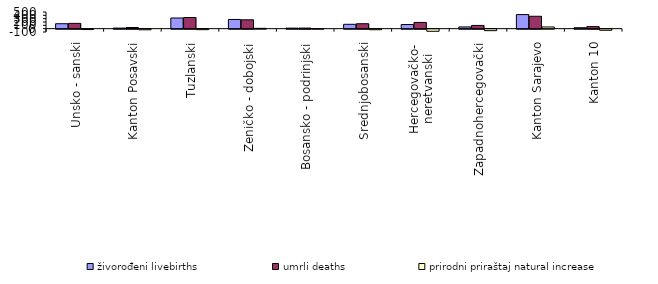
| Category | živorođeni livebirths | umrli deaths | prirodni priraštaj natural increase |
|---|---|---|---|
| Unsko - sanski | 148 | 159 | -11 |
| Kanton Posavski | 17 | 35 | -18 |
| Tuzlanski | 320 | 335 | -15 |
| Zeničko - dobojski | 276 | 266 | 10 |
| Bosansko - podrinjski | 16 | 17 | -1 |
| Srednjobosanski | 131 | 148 | -17 |
| Hercegovačko-
neretvanski | 124 | 187 | -63 |
| Zapadnohercegovački | 52 | 97 | -45 |
| Kanton Sarajevo | 423 | 372 | 51 |
| Kanton 10 | 28 | 61 | -33 |